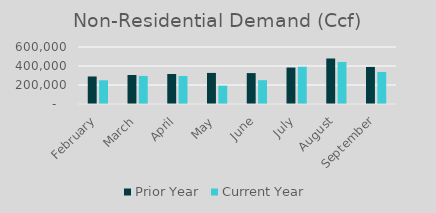
| Category | Prior Year | Current Year |
|---|---|---|
| February | 289857 | 249807 |
| March | 305426 | 295423 |
| April | 315985 | 295012.49 |
| May | 327135 | 192797 |
| June | 325420 | 250692.26 |
| July | 383814 | 392092.25 |
| August | 478930 | 442683.78 |
| September | 390084 | 337663.69 |